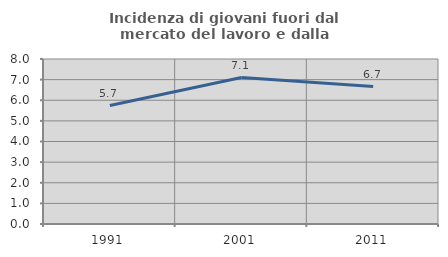
| Category | Incidenza di giovani fuori dal mercato del lavoro e dalla formazione  |
|---|---|
| 1991.0 | 5.744 |
| 2001.0 | 7.102 |
| 2011.0 | 6.665 |